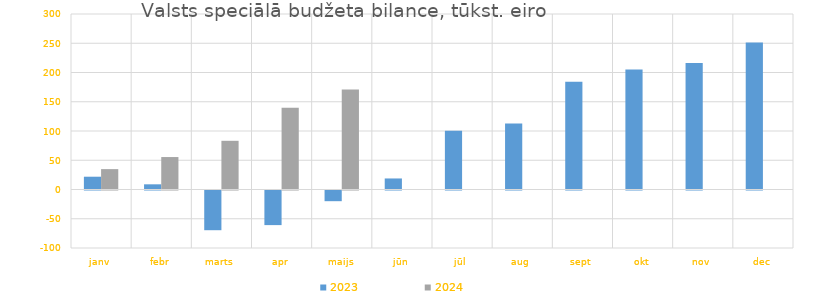
| Category | 2023 | 2024 |
|---|---|---|
| janv | 21850.373 | 34837.439 |
| febr | 8860.895 | 55473.418 |
| marts | -67878.961 | 83250.759 |
| apr | -59148.923 | 139544.306 |
| maijs | -18273.46 | 171040.531 |
| jūn | 18868.968 | 0 |
| jūl | 100483.566 | 0 |
| aug | 112828.993 | 0 |
| sept | 184000.505 | 0 |
| okt | 205121.199 | 0 |
| nov | 216425.067 | 0 |
| dec | 251412.782 | 0 |